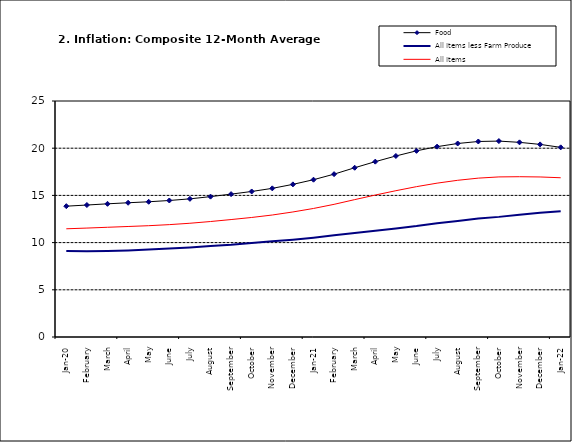
| Category | Food | All Items less Farm Produce | All Items |
|---|---|---|---|
| Jan-20 | 13.859 | 9.112 | 11.462 |
| February | 13.98 | 9.086 | 11.539 |
| March | 14.109 | 9.112 | 11.624 |
| April | 14.221 | 9.174 | 11.706 |
| May | 14.325 | 9.267 | 11.791 |
| June | 14.46 | 9.375 | 11.904 |
| July | 14.634 | 9.484 | 12.049 |
| August | 14.869 | 9.638 | 12.233 |
| September | 15.135 | 9.775 | 12.44 |
| October | 15.416 | 9.965 | 12.664 |
| November | 15.746 | 10.136 | 12.923 |
| December | 16.169 | 10.308 | 13.246 |
| Jan-21 | 16.662 | 10.519 | 13.616 |
| February | 17.251 | 10.767 | 14.053 |
| March | 17.929 | 11.015 | 14.554 |
| April | 18.576 | 11.247 | 15.039 |
| May | 19.176 | 11.502 | 15.499 |
| June | 19.721 | 11.75 | 15.927 |
| July | 20.165 | 12.052 | 16.298 |
| August | 20.499 | 12.291 | 16.601 |
| September | 20.711 | 12.553 | 16.83 |
| October | 20.753 | 12.725 | 16.958 |
| November | 20.619 | 12.956 | 16.979 |
| December | 20.403 | 13.161 | 16.953 |
| Jan-22 | 20.089 | 13.326 | 16.869 |